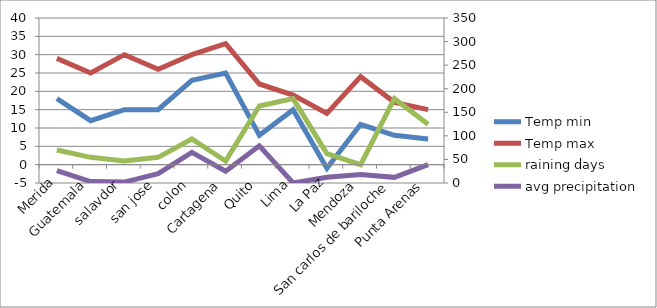
| Category | Temp min | Temp max | raining days |
|---|---|---|---|
| Merida | 18 | 29 | 4 |
| Guatemala | 12 | 25 | 2 |
| salavdor | 15 | 30 | 1 |
| san jose | 15 | 26 | 2 |
| colon | 23 | 30 | 7 |
| Cartagena | 25 | 33 | 1 |
| Quito | 8 | 22 | 16 |
| Lima | 15 | 19 | 18 |
| La Paz | -1 | 14 | 3 |
| Mendoza | 11 | 24 | 0 |
| San carlos de bariloche | 8 | 17 | 18 |
| Punta Arenas | 7 | 15 | 11 |